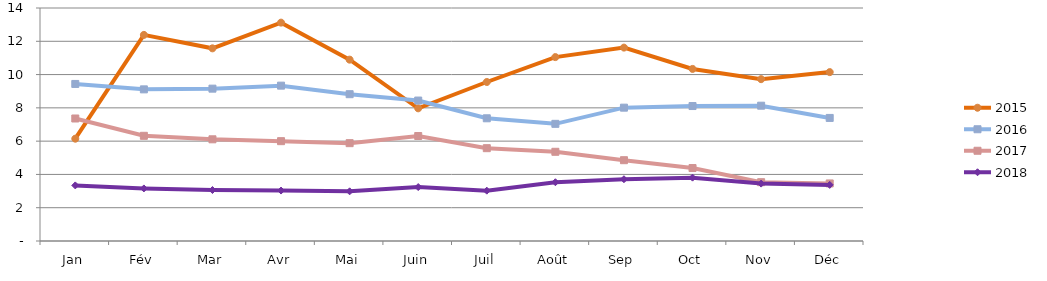
| Category | 2015 | 2016 | 2017 | 2018 |
|---|---|---|---|---|
| Jan | 6.147 | 9.436 | 7.361 | 3.34 |
| Fév | 12.385 | 9.111 | 6.321 | 3.159 |
| Mar | 11.577 | 9.154 | 6.111 | 3.062 |
| Avr | 13.121 | 9.335 | 5.999 | 3.031 |
| Mai | 10.896 | 8.821 | 5.878 | 2.984 |
| Juin | 7.972 | 8.439 | 6.309 | 3.242 |
| Juil | 9.554 | 7.373 | 5.577 | 3.025 |
| Août | 11.05 | 7.04 | 5.36 | 3.53 |
| Sep | 11.62 | 8.012 | 4.855 | 3.712 |
| Oct | 10.339 | 8.109 | 4.384 | 3.806 |
| Nov | 9.724 | 8.13 | 3.533 | 3.449 |
| Déc | 10.148 | 7.395 | 3.458 | 3.371 |